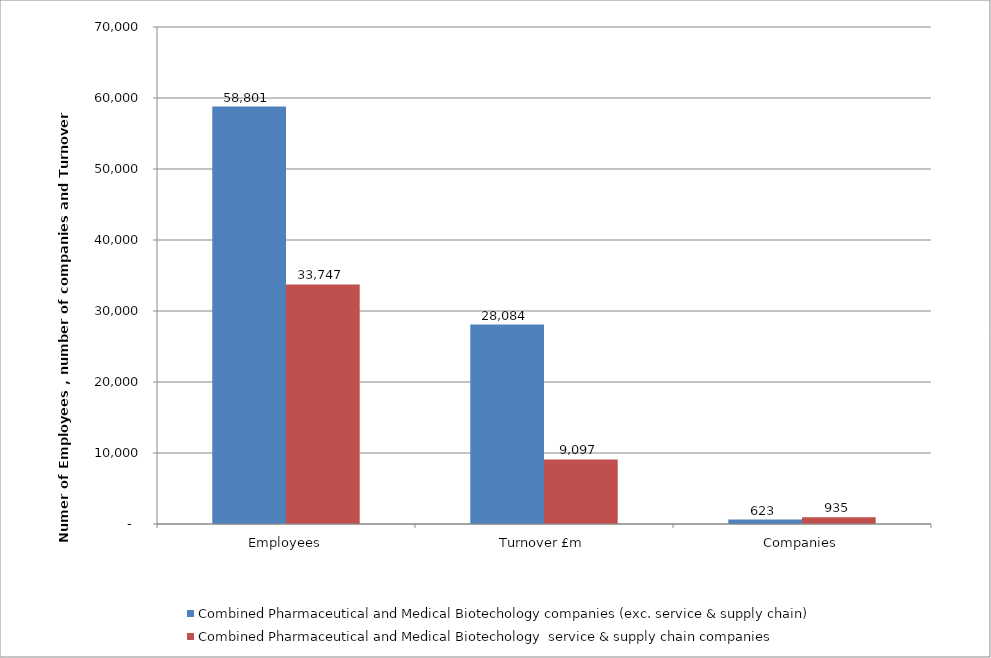
| Category | Combined Pharmaceutical and Medical Biotechology companies (exc. service & supply chain) | Combined Pharmaceutical and Medical Biotechology  service & supply chain companies |
|---|---|---|
| Employees | 58801 | 33747 |
| Turnover £m | 28084 | 9097 |
| Companies | 623 | 935 |